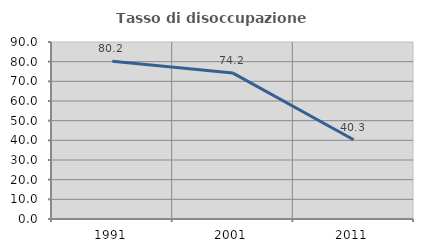
| Category | Tasso di disoccupazione giovanile  |
|---|---|
| 1991.0 | 80.184 |
| 2001.0 | 74.194 |
| 2011.0 | 40.323 |